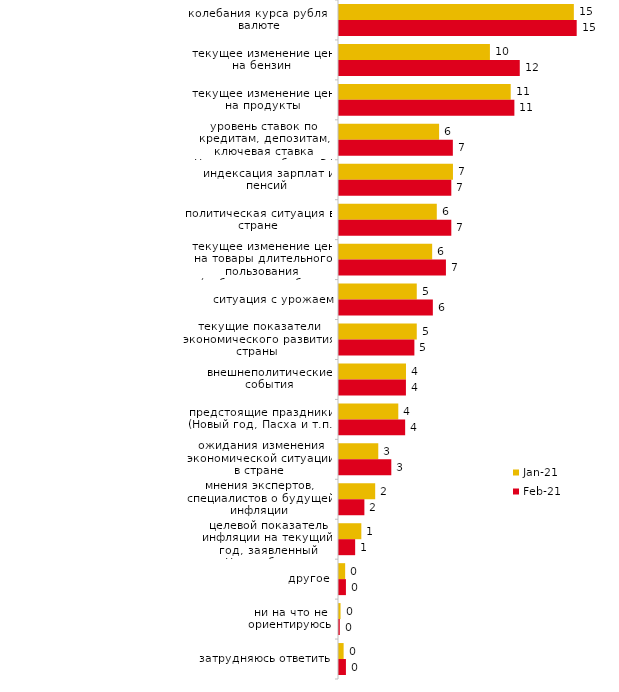
| Category | янв.21 | фев.21 |
|---|---|---|
| колебания курса рубля к валюте | 15.152 | 15.335 |
| текущее изменение цен на бензин | 9.737 | 11.663 |
| текущее изменение цен на продукты | 11.078 | 11.315 |
| уровень ставок по кредитам, депозитам, ключевая ставка Центрального банка РФ | 6.458 | 7.345 |
| индексация зарплат и пенсий | 7.352 | 7.246 |
| политическая ситуация в стране | 6.309 | 7.246 |
| текущее изменение цен на товары длительного пользования (мебель, автомобиль, бытовая техника и т.п.) | 6.011 | 6.898 |
| ситуация с урожаем | 5.017 | 6.055 |
| текущие показатели экономического развития страны | 5.017 | 4.864 |
| внешнеполитические события | 4.322 | 4.318 |
| предстоящие праздники (Новый год, Пасха и т.п.) | 3.825 | 4.268 |
| ожидания изменения экономической ситуации в стране | 2.534 | 3.375 |
| мнения экспертов, специалистов о будущей инфляции | 2.335 | 1.638 |
| целевой показатель инфляции на текущий год, заявленный Центробанком | 1.441 | 1.042 |
| другое | 0.397 | 0.447 |
| ни на что не ориентируюсь | 0.099 | 0.05 |
| затрудняюсь ответить | 0.298 | 0.447 |